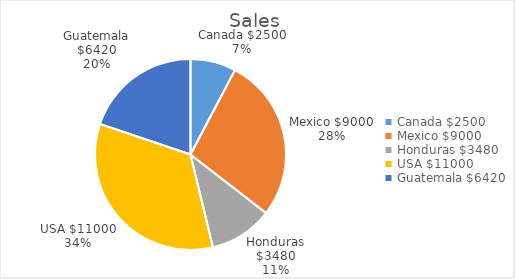
| Category | Sales |
|---|---|
| 0 | 2500 |
| 1 | 9000 |
| 2 | 3480 |
| 3 | 11000 |
| 4 | 6420 |